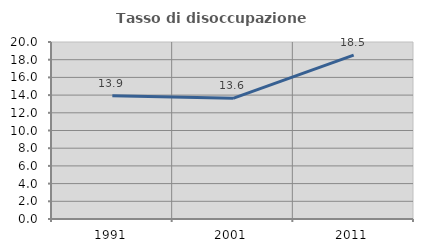
| Category | Tasso di disoccupazione giovanile  |
|---|---|
| 1991.0 | 13.924 |
| 2001.0 | 13.636 |
| 2011.0 | 18.519 |